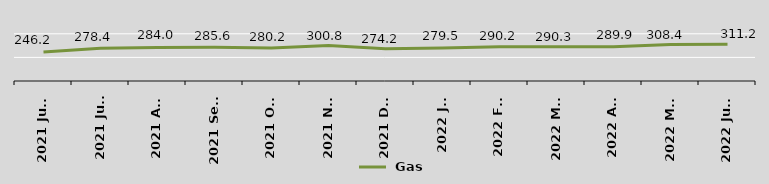
| Category |  Gas |
|---|---|
| 2021 June | 246.2 |
| 2021 July | 278.4 |
| 2021 Aug | 284 |
| 2021 Sept | 285.6 |
| 2021 Oct | 280.2 |
| 2021 Nov | 300.8 |
| 2021 Dec | 274.2 |
| 2022 Jan | 279.5 |
| 2022 Feb | 290.2 |
| 2022 Mar | 290.3 |
| 2022 Apr | 289.9 |
| 2022 May | 308.4 |
| 2022 June | 311.2 |